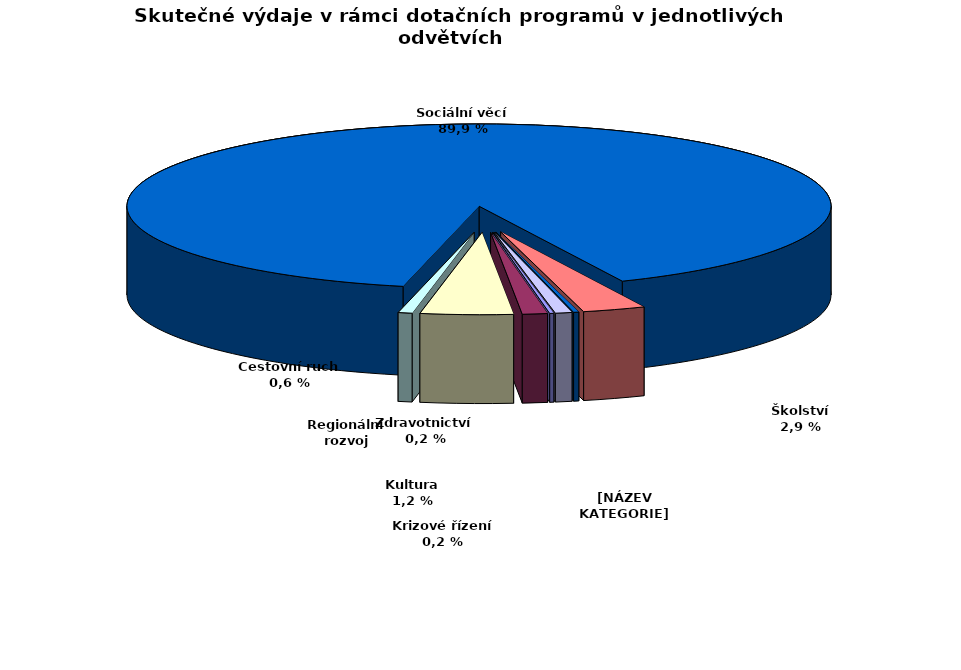
| Category | Series 0 |
|---|---|
| Krizové řízení | 3929.181 |
| Kultura | 23770.614 |
| Regionální rozvoj | 87744.279 |
| Cestovní ruch | 13278.123 |
| Sociální věcí | 1853321.593 |
| Školství | 59577.767 |
| Zdravotnictví | 5000 |
| Životní prostředí  | 15831.647 |